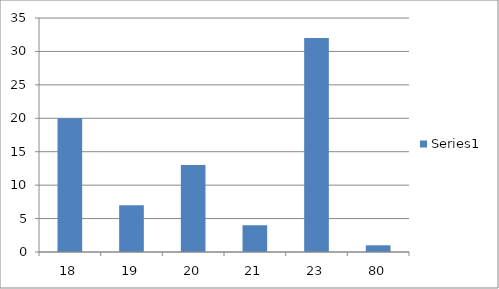
| Category | Series 0 |
|---|---|
| 18.0 | 20 |
| 19.0 | 7 |
| 20.0 | 13 |
| 21.0 | 4 |
| 23.0 | 32 |
| 80.0 | 1 |